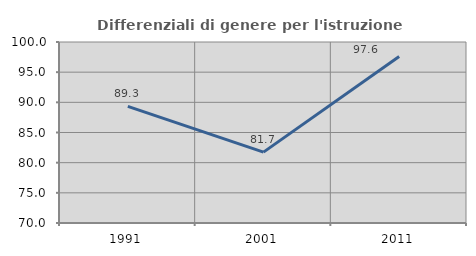
| Category | Differenziali di genere per l'istruzione superiore |
|---|---|
| 1991.0 | 89.333 |
| 2001.0 | 81.745 |
| 2011.0 | 97.587 |